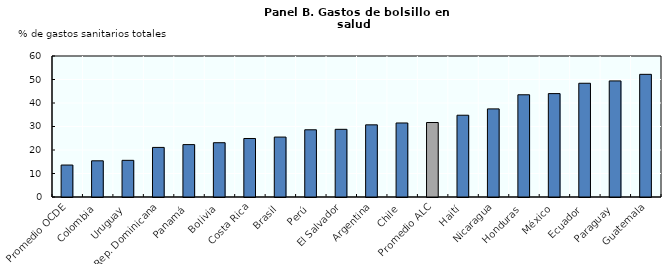
| Category | Series 0 |
|---|---|
| Promedio OCDE | 13.6 |
| Colombia | 15.4 |
| Uruguay | 15.6 |
| Rep. Dominicana | 21.1 |
| Panamá | 22.3 |
| Bolivia | 23.1 |
| Costa Rica | 24.9 |
| Brasil | 25.5 |
| Perú | 28.6 |
| El Salvador | 28.8 |
| Argentina | 30.7 |
| Chile | 31.5 |
| Promedio ALC | 31.7 |
| Haití | 34.8 |
| Nicaragua | 37.5 |
| Honduras | 43.5 |
| México | 44 |
| Ecuador | 48.4 |
| Paraguay | 49.4 |
| Guatemala | 52.2 |